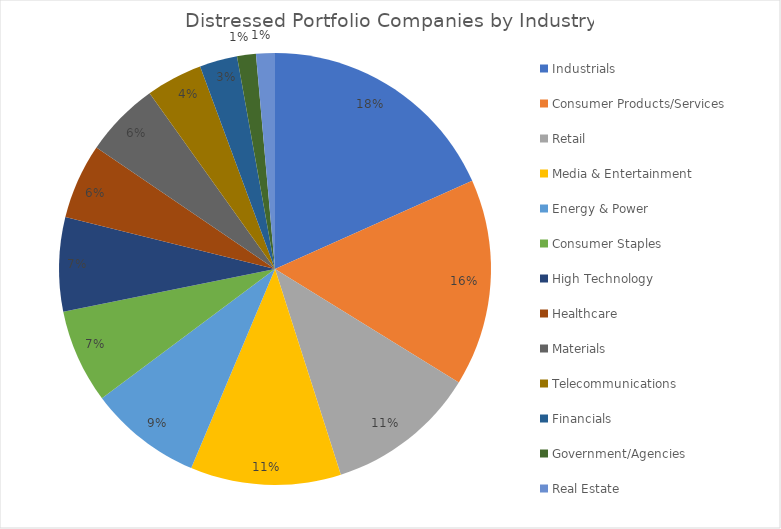
| Category | Series 0 |
|---|---|
| Industrials | 13 |
| Consumer Products/Services | 11 |
| Retail | 8 |
| Media & Entertainment | 8 |
| Energy & Power | 6 |
| Consumer Staples | 5 |
| High Technology | 5 |
| Healthcare | 4 |
| Materials | 4 |
| Telecommunications | 3 |
| Financials | 2 |
| Government/Agencies | 1 |
| Real Estate | 1 |